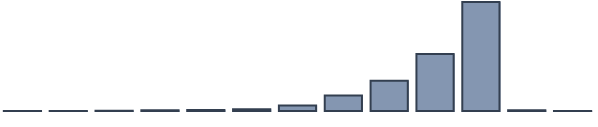
| Category | Series 0 |
|---|---|
| 0 | 0.043 |
| 1 | 0.043 |
| 2 | 0.13 |
| 3 | 0.391 |
| 4 | 0.435 |
| 5 | 0.739 |
| 6 | 2.522 |
| 7 | 6.957 |
| 8 | 13.609 |
| 9 | 25.652 |
| 10 | 49.13 |
| 11 | 0.304 |
| 12 | 0.043 |